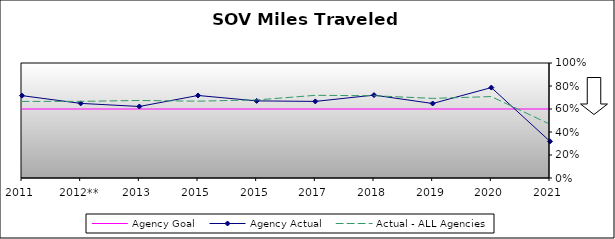
| Category | Agency Goal | Agency Actual | Actual - ALL Agencies |
|---|---|---|---|
| 2011 | 0.6 | 0.716 | 0.666 |
| 2012** | 0.6 | 0.649 | 0.666 |
| 2013 | 0.6 | 0.622 | 0.674 |
| 2015 | 0.6 | 0.718 | 0.668 |
| 2015 | 0.6 | 0.671 | 0.679 |
| 2017 | 0.6 | 0.666 | 0.719 |
| 2018 | 0.6 | 0.721 | 0.715 |
| 2019 | 0.6 | 0.648 | 0.692 |
| 2020 | 0.6 | 0.786 | 0.708 |
| 2021 | 0.6 | 0.319 | 0.467 |